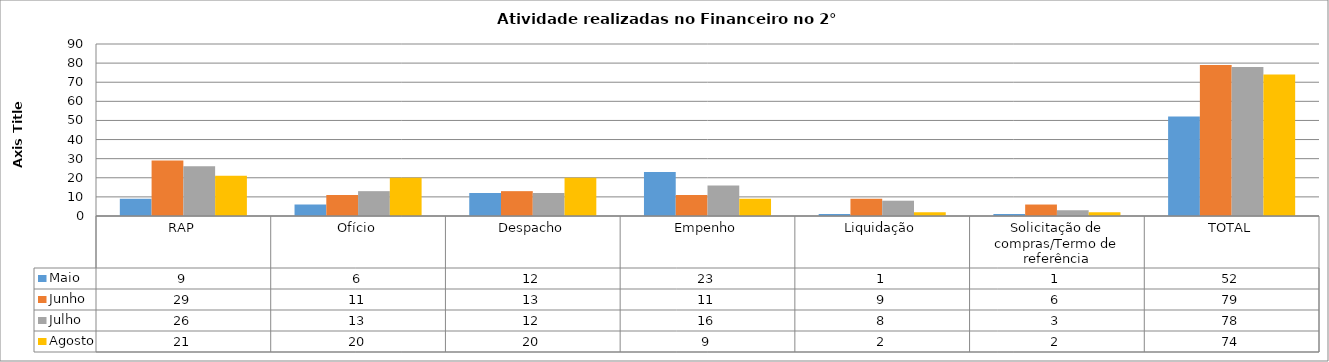
| Category | Maio | Junho | Julho | Agosto |
|---|---|---|---|---|
| RAP | 9 | 29 | 26 | 21 |
| Ofício | 6 | 11 | 13 | 20 |
| Despacho | 12 | 13 | 12 | 20 |
| Empenho | 23 | 11 | 16 | 9 |
| Liquidação | 1 | 9 | 8 | 2 |
| Solicitação de compras/Termo de referência | 1 | 6 | 3 | 2 |
| TOTAL | 52 | 79 | 78 | 74 |